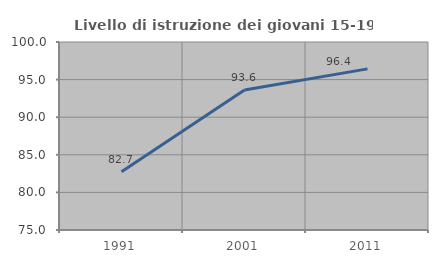
| Category | Livello di istruzione dei giovani 15-19 anni |
|---|---|
| 1991.0 | 82.734 |
| 2001.0 | 93.617 |
| 2011.0 | 96.429 |